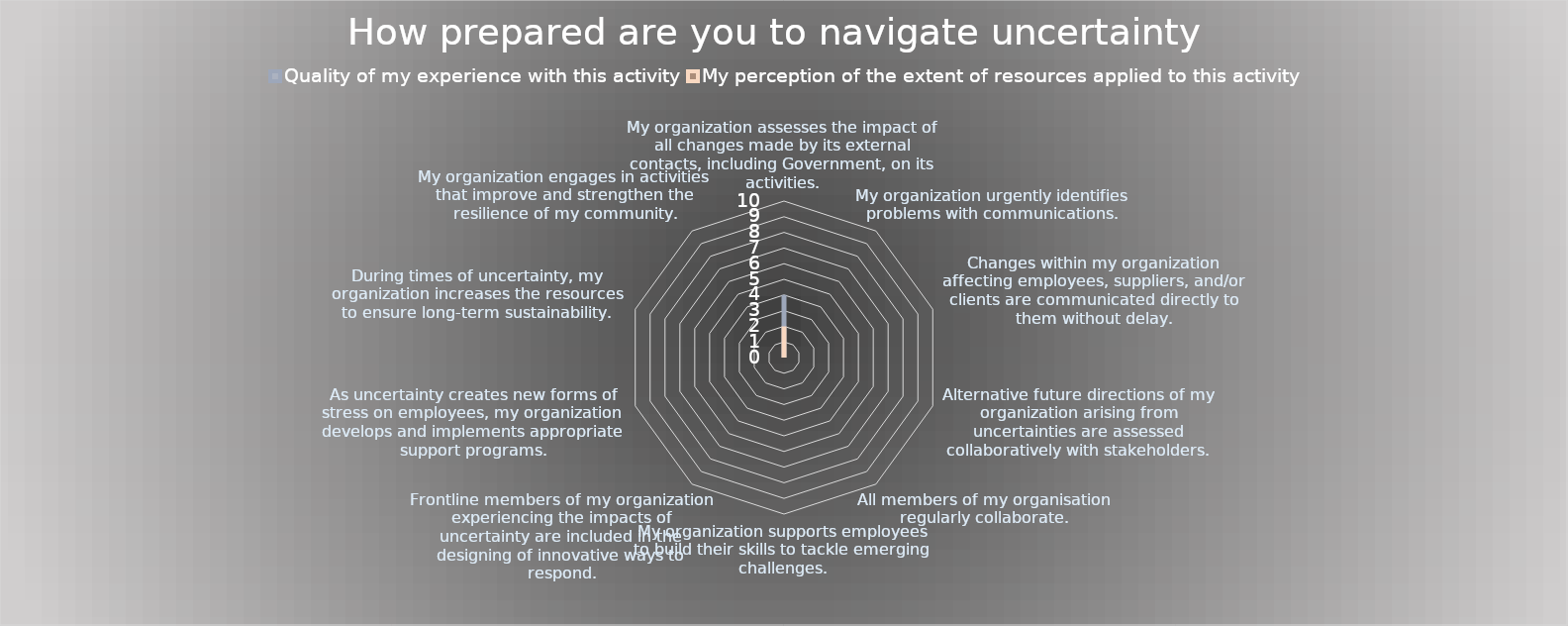
| Category | Quality of my experience with this activity | My perception of the extent of resources applied to this activity |
|---|---|---|
| My organization assesses the impact of all changes made by its external contacts, including Government, on its activities. | 4 | 2 |
| My organization urgently identifies problems with communications. | 0 | 0 |
| Changes within my organization affecting employees, suppliers, and/or clients are communicated directly to them without delay. | 0 | 0 |
| Alternative future directions of my organization arising from uncertainties are assessed collaboratively with stakeholders. | 0 | 0 |
| All members of my organisation regularly collaborate. | 0 | 0 |
| My organization supports employees to build their skills to tackle emerging challenges. | 0 | 0 |
| Frontline members of my organization experiencing the impacts of uncertainty are included in the designing of innovative ways to respond. | 0 | 0 |
| As uncertainty creates new forms of stress on employees, my organization develops and implements appropriate support programs. | 0 | 0 |
| During times of uncertainty, my organization increases the resources to ensure long-term sustainability. | 0 | 0 |
| My organization engages in activities that improve and strengthen the resilience of my community. | 0 | 0 |